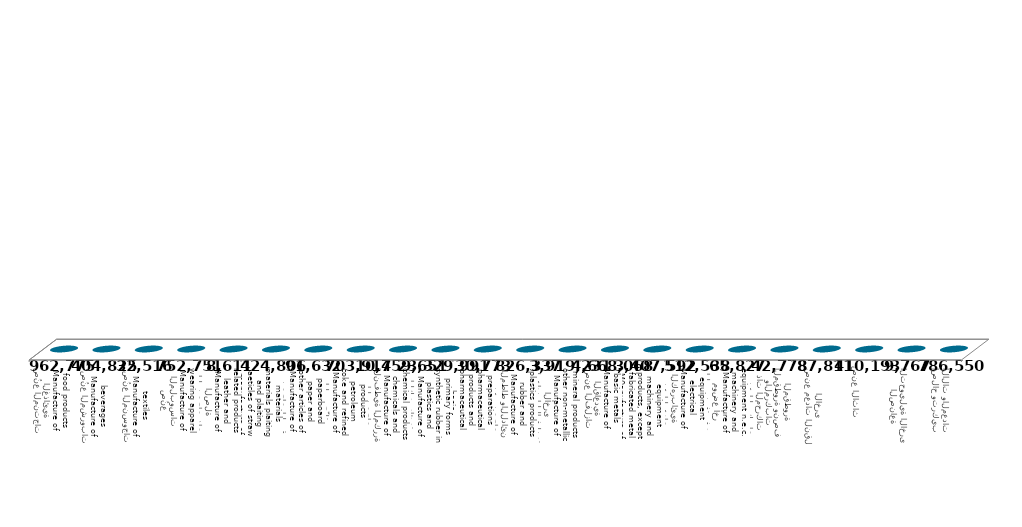
| Category | Column2 |
|---|---|
| صُنع المنتجات الغذائية
Manufacture of food products | 962775 |
| صُنع المشروبات
Manufacture of beverages | 404825 |
| صُنع المنسوجات
Manufacture of textiles | 32516 |
| صُنع الملبوسات
Manufacture of wearing apparel | 752751 |
| صُنع المنتجات الجلدية والمنتجات ذات الصلة
Manufacture of leather and related products | 8611 |
| صُنع الخشب ومنتجات الخشب والفلين ، باستثناء الأثاث ، صُنع أصناف من القش ومواد الضفر
Manufacture of wood and of products of wood and cork, except furniture, manufacture of aeticles of straw and plaiting materials plaiting materials | 424806 |
| صُنع الورق ومنتجات الورق
Manufacture of other articles of paper and paperboard | 91632 |
| الطباعة واستنساخ وسائط الأعلام المسجّلة
Manufacture of coke and refined petroleum products | 703917 |
| صنع فحم الكوك والمنتجات النفطية المكررة
Manufacture of chemicals and chemical products | 10459651 |
| صُنع المواد الكيميائية والمنتجات الكيميائية
Manufacture of plastics and synthetic rubber in primary forms | 23329991 |
| صنع المنتجات الصيدلانية الأساسية والمستحضرات الصيدلانية
Manufacture of basic pharmaceutical products and pharmaceutical preparations | 30773 |
| صنع منتجات المطاط واللدائن
Manufacture of rubber and plastics products | 826337 |
| صنع منتجات المعادن اللافلزية الأخرى
Manufacture of other non-metallic mineral products | 3919231 |
| صنع الفلزات القاعدية
Manufacture of basic metals | 4668068 |
| صنع منتجات المعادن المشكلة باستثناء الآلات والمعدات
M0anufacture of fabricated metal products, except machinery and equipment | 3407592 |
| صنع المعدات الكهربائية
Manufacture of electrical equipment | 512538 |
| صنع الآلات والمعدات غير المصنفة في موضع أخر
Manufacture of machinery and equipment n.e.c. | 65827 |
| صنع المركبات ذات المحركات والمركبات المقطورة ونصف المقطورة | 42778 |
| صنع معدات النقل الأخرى | 87811 |
| صنع الأثاث | 410193 |
| الصناعة التحويلية الأخرى | 9767 |
| إصلاح وتركيب الآلات والمعدات | 786550 |